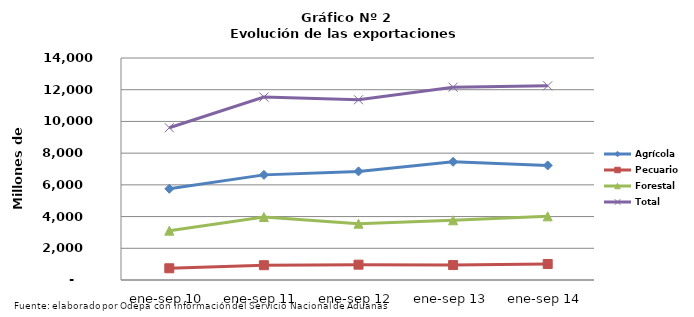
| Category | Agrícola | Pecuario | Forestal | Total |
|---|---|---|---|---|
| ene-sep 10 | 5752610 | 739052 | 3110969 | 9602631 |
| ene-sep 11 | 6629505 | 932901 | 3973160 | 11535566 |
| ene-sep 12 | 6849765 | 967053 | 3549447 | 11366265 |
| ene-sep 13 | 7452092 | 941268 | 3765941 | 12159301 |
| ene-sep 14 | 7224180 | 1009074 | 4013393 | 12246647 |